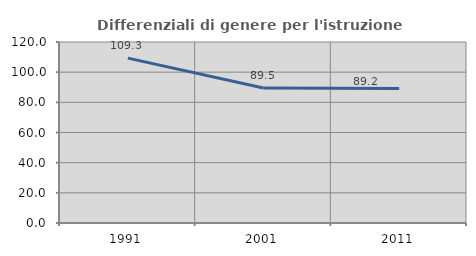
| Category | Differenziali di genere per l'istruzione superiore |
|---|---|
| 1991.0 | 109.295 |
| 2001.0 | 89.493 |
| 2011.0 | 89.204 |